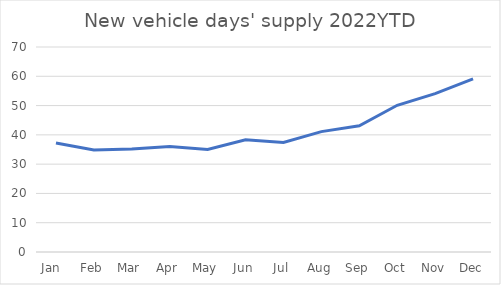
| Category | Series 0 |
|---|---|
| Jan  | 37.2 |
| Feb | 34.8 |
| Mar | 35.2 |
| Apr | 36 |
| May | 35 |
| Jun | 38.3 |
| Jul | 37.4 |
| Aug | 41.1 |
| Sep | 43.1 |
| Oct | 50.1 |
| Nov | 54.1 |
| Dec | 59.1 |